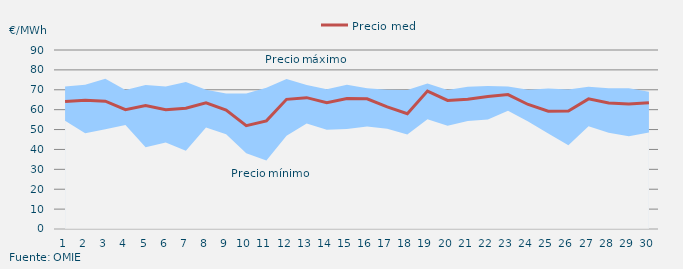
| Category | Precio medio |
|---|---|
| 1 | 64.097 |
| 2 | 64.746 |
| 3 | 64.293 |
| 4 | 59.959 |
| 5 | 62.059 |
| 6 | 59.966 |
| 7 | 60.698 |
| 8 | 63.404 |
| 9 | 59.805 |
| 10 | 51.953 |
| 11 | 54.376 |
| 12 | 65.198 |
| 13 | 66.041 |
| 14 | 63.529 |
| 15 | 65.587 |
| 16 | 65.464 |
| 17 | 61.391 |
| 18 | 57.991 |
| 19 | 69.343 |
| 20 | 64.631 |
| 21 | 65.279 |
| 22 | 66.646 |
| 23 | 67.587 |
| 24 | 62.607 |
| 25 | 59.25 |
| 26 | 59.327 |
| 27 | 65.422 |
| 28 | 63.391 |
| 29 | 62.821 |
| 30 | 63.457 |